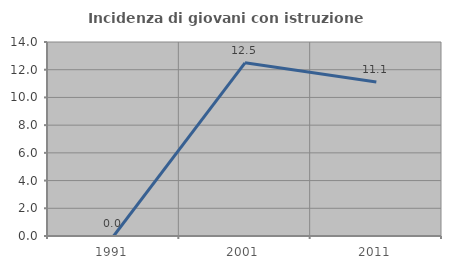
| Category | Incidenza di giovani con istruzione universitaria |
|---|---|
| 1991.0 | 0 |
| 2001.0 | 12.5 |
| 2011.0 | 11.111 |